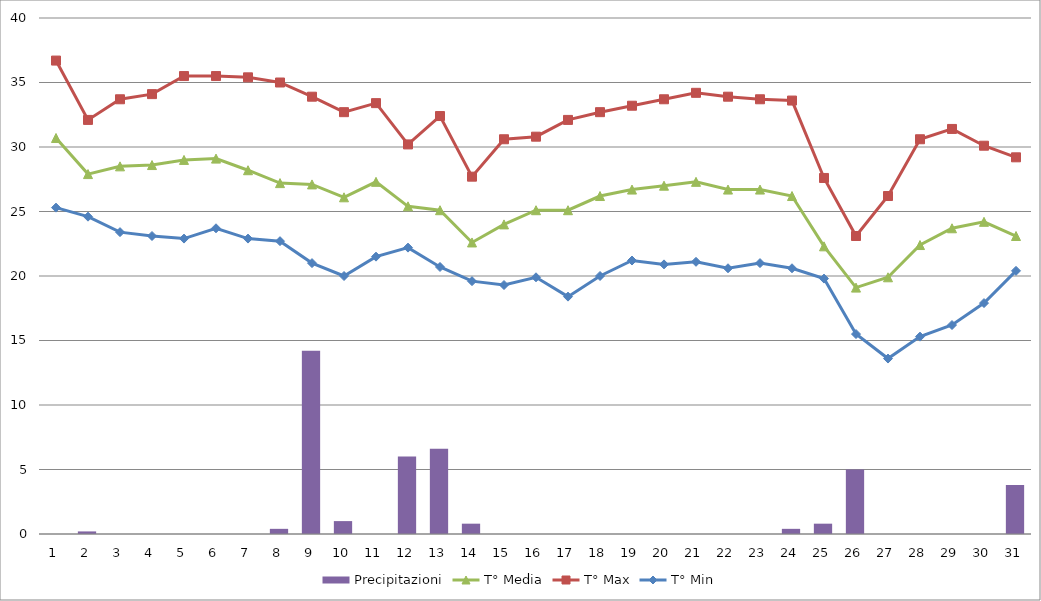
| Category | Precipitazioni |
|---|---|
| 0 | 0 |
| 1 | 0.2 |
| 2 | 0 |
| 3 | 0 |
| 4 | 0 |
| 5 | 0 |
| 6 | 0 |
| 7 | 0.4 |
| 8 | 14.2 |
| 9 | 1 |
| 10 | 0 |
| 11 | 6 |
| 12 | 6.6 |
| 13 | 0.8 |
| 14 | 0 |
| 15 | 0 |
| 16 | 0 |
| 17 | 0 |
| 18 | 0 |
| 19 | 0 |
| 20 | 0 |
| 21 | 0 |
| 22 | 0 |
| 23 | 0.4 |
| 24 | 0.8 |
| 25 | 5 |
| 26 | 0 |
| 27 | 0 |
| 28 | 0 |
| 29 | 0 |
| 30 | 3.8 |